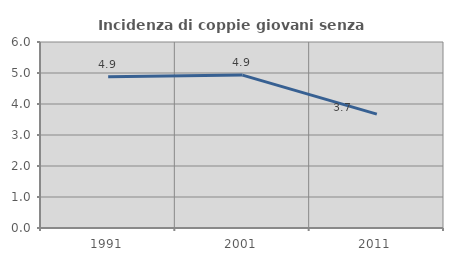
| Category | Incidenza di coppie giovani senza figli |
|---|---|
| 1991.0 | 4.875 |
| 2001.0 | 4.932 |
| 2011.0 | 3.675 |